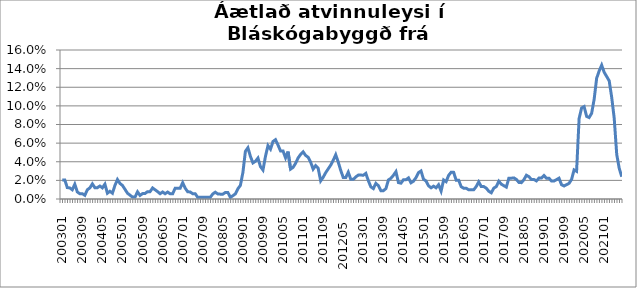
| Category | Series 0 |
|---|---|
| 200301 | 0.02 |
| 200302 | 0.02 |
| 200303 | 0.012 |
| 200304 | 0.012 |
| 200305 | 0.01 |
| 200306 | 0.016 |
| 200307 | 0.008 |
| 200308 | 0.006 |
| 200309 | 0.006 |
| 200310 | 0.004 |
| 200311 | 0.01 |
| 200312 | 0.012 |
| 200401 | 0.016 |
| 200402 | 0.012 |
| 200403 | 0.012 |
| 200404 | 0.014 |
| 200405 | 0.012 |
| 200406 | 0.016 |
| 200407 | 0.006 |
| 200408 | 0.008 |
| 200409 | 0.006 |
| 200410 | 0.015 |
| 200411 | 0.021 |
| 200412 | 0.017 |
| 200501 | 0.015 |
| 200502 | 0.01 |
| 200503 | 0.006 |
| 200504 | 0.004 |
| 200505 | 0.002 |
| 200506 | 0.002 |
| 200507 | 0.008 |
| 200508 | 0.004 |
| 200509 | 0.006 |
| 200510 | 0.006 |
| 200511 | 0.008 |
| 200512 | 0.008 |
| 200601 | 0.012 |
| 200602 | 0.01 |
| 200603 | 0.008 |
| 200604 | 0.006 |
| 200605 | 0.008 |
| 200606 | 0.006 |
| 200607 | 0.007 |
| 200608 | 0.006 |
| 200609 | 0.006 |
| 200610 | 0.012 |
| 200611 | 0.012 |
| 200612 | 0.012 |
| 200701 | 0.017 |
| 200702 | 0.012 |
| 200703 | 0.008 |
| 200704 | 0.008 |
| 200705 | 0.006 |
| 200706 | 0.006 |
| 200707 | 0.002 |
| 200708 | 0.002 |
| 200709 | 0.002 |
| 200710 | 0.002 |
| 200711 | 0.002 |
| 200712 | 0.002 |
| 200801 | 0.005 |
| 200802 | 0.007 |
| 200803 | 0.005 |
| 200804 | 0.005 |
| 200805 | 0.005 |
| 200806 | 0.007 |
| 200807 | 0.007 |
| 200808 | 0.002 |
| 200809 | 0.004 |
| 200810 | 0.005 |
| 200811 | 0.011 |
| 200812 | 0.015 |
| 200901 | 0.028 |
| 200902 | 0.051 |
| 200903 | 0.055 |
| 200904 | 0.046 |
| 200905 | 0.039 |
| 200906 | 0.04 |
| 200907 | 0.044 |
| 200908 | 0.035 |
| 200909 | 0.031 |
| 200910 | 0.046 |
| 200911 | 0.057 |
| 200912 | 0.054 |
| 201001 | 0.062 |
| 201002 | 0.064 |
| 201003 | 0.058 |
| 201004 | 0.052 |
| 201005 | 0.052 |
| 201006 | 0.044 |
| 201007 | 0.051 |
| 201008 | 0.032 |
| 201009 | 0.034 |
| 201010 | 0.038 |
| 201011 | 0.044 |
| 201012 | 0.048 |
| 201101 | 0.051 |
| 201102 | 0.047 |
| 201103 | 0.045 |
| 201104 | 0.04 |
| 201105 | 0.032 |
| 201106 | 0.036 |
| 201107 | 0.033 |
| 201108 | 0.019 |
| 201109 | 0.023 |
| 201110 | 0.028 |
| 201111 | 0.032 |
| 201112 | 0.036 |
| 201201  | 0.042 |
| 201202  | 0.048 |
| 201203  | 0.04 |
| 201204  | 0.031 |
| 201205  | 0.023 |
| 201206  | 0.023 |
| 201207  | 0.029 |
| 201208  | 0.021 |
| 201209  | 0.021 |
| 201210  | 0.024 |
| 201211  | 0.026 |
| 201212  | 0.026 |
| 201301 | 0.026 |
| 201302 | 0.028 |
| 201303 | 0.02 |
| 201304 | 0.013 |
| 201305 | 0.011 |
| 201306 | 0.017 |
| 201307 | 0.014 |
| 201308 | 0.009 |
| 201309 | 0.009 |
| 201310 | 0.011 |
| 201311 | 0.02 |
| 201312 | 0.022 |
| 201401 | 0.025 |
| 201402 | 0.029 |
| 201403 | 0.018 |
| 201404 | 0.017 |
| 201405 | 0.021 |
| 201406 | 0.021 |
| 201407 | 0.023 |
| 201408 | 0.017 |
| 201409 | 0.019 |
| 201410 | 0.023 |
| 201411 | 0.028 |
| 201412 | 0.03 |
| 201501 | 0.021 |
| 201502 | 0.019 |
| 201503 | 0.014 |
| 201504 | 0.012 |
| 201505 | 0.014 |
| 201506 | 0.012 |
| 201507 | 0.015 |
| 201508 | 0.009 |
| 201509 | 0.02 |
| 201510 | 0.019 |
| 201511 | 0.025 |
| 201512 | 0.029 |
| 201601 | 0.029 |
| 201602 | 0.02 |
| 201603 | 0.02 |
| 201604 | 0.013 |
| 201605 | 0.012 |
| 201606 | 0.012 |
| 201607 | 0.01 |
| 201608 | 0.01 |
| 201609 | 0.01 |
| 201610 | 0.013 |
| 201611 | 0.018 |
| 201612 | 0.013 |
| 201701 | 0.013 |
| 201702 | 0.012 |
| 201703 | 0.008 |
| 201704 | 0.007 |
| 201705 | 0.012 |
| 201706 | 0.013 |
| 201707 | 0.019 |
| 201708 | 0.016 |
| 201709 | 0.014 |
| 201710 | 0.013 |
| 201711 | 0.022 |
| 201712 | 0.022 |
| 201801 | 0.023 |
| 201802 | 0.021 |
| 201803 | 0.018 |
| 201804 | 0.018 |
| 201805 | 0.021 |
| 201806 | 0.026 |
| 201807 | 0.024 |
| 201808 | 0.021 |
| 201809 | 0.021 |
| 201810 | 0.019 |
| 201811 | 0.022 |
| 201812 | 0.022 |
| 201901 | 0.025 |
| 201902 | 0.022 |
| 201903 | 0.022 |
| 201904 | 0.019 |
| 201905 | 0.019 |
| 201906 | 0.021 |
| 201907 | 0.022 |
| 201908 | 0.015 |
| 201909 | 0.014 |
| 201910 | 0.015 |
| 201911 | 0.017 |
| 201912 | 0.021 |
| 202001 | 0.031 |
| 202002 | 0.03 |
| 202003 | 0.086 |
| 202004 | 0.098 |
| 202005 | 0.099 |
| 202006 | 0.089 |
| 202007 | 0.087 |
| 202008 | 0.092 |
| 202009 | 0.107 |
| 202010 | 0.13 |
| 202011 | 0.138 |
| 202012 | 0.144 |
| 202101 | 0.136 |
| 202102 | 0.131 |
| 202103 | 0.127 |
| 202104 | 0.109 |
| 202105 | 0.087 |
| 202106 | 0.048 |
| 202107 | 0.033 |
| 202108 | 0.024 |